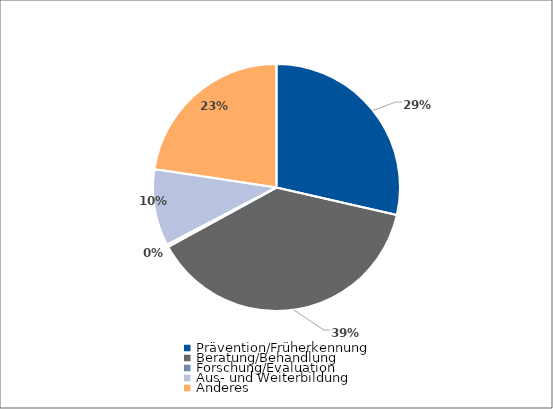
| Category | Series 0 |
|---|---|
| Prävention/Früherkennung | 46167 |
| Beratung/Behandlung | 62100 |
| Forschung/Evaluation | 532 |
| Aus- und Weiterbildung | 16250 |
| Anderes | 36542 |